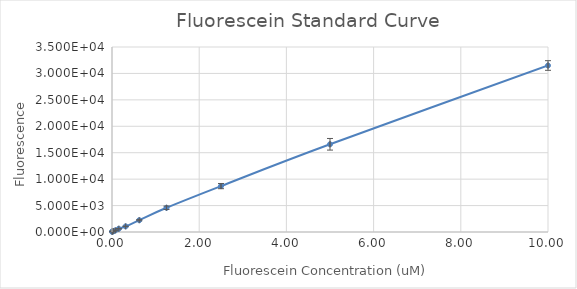
| Category | Series 0 |
|---|---|
| 10.0 | 31500.5 |
| 5.0 | 16595.25 |
| 2.5 | 8685.75 |
| 1.25 | 4586 |
| 0.625 | 2231.25 |
| 0.3125 | 1065 |
| 0.15625 | 615.5 |
| 0.078125 | 304.25 |
| 0.0390625 | 191.25 |
| 0.01953125 | 127.5 |
| 0.009765625 | 89.75 |
| 0.0 | 60.5 |